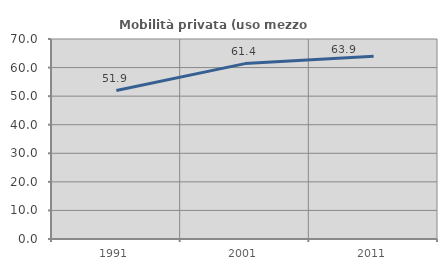
| Category | Mobilità privata (uso mezzo privato) |
|---|---|
| 1991.0 | 51.943 |
| 2001.0 | 61.383 |
| 2011.0 | 63.924 |